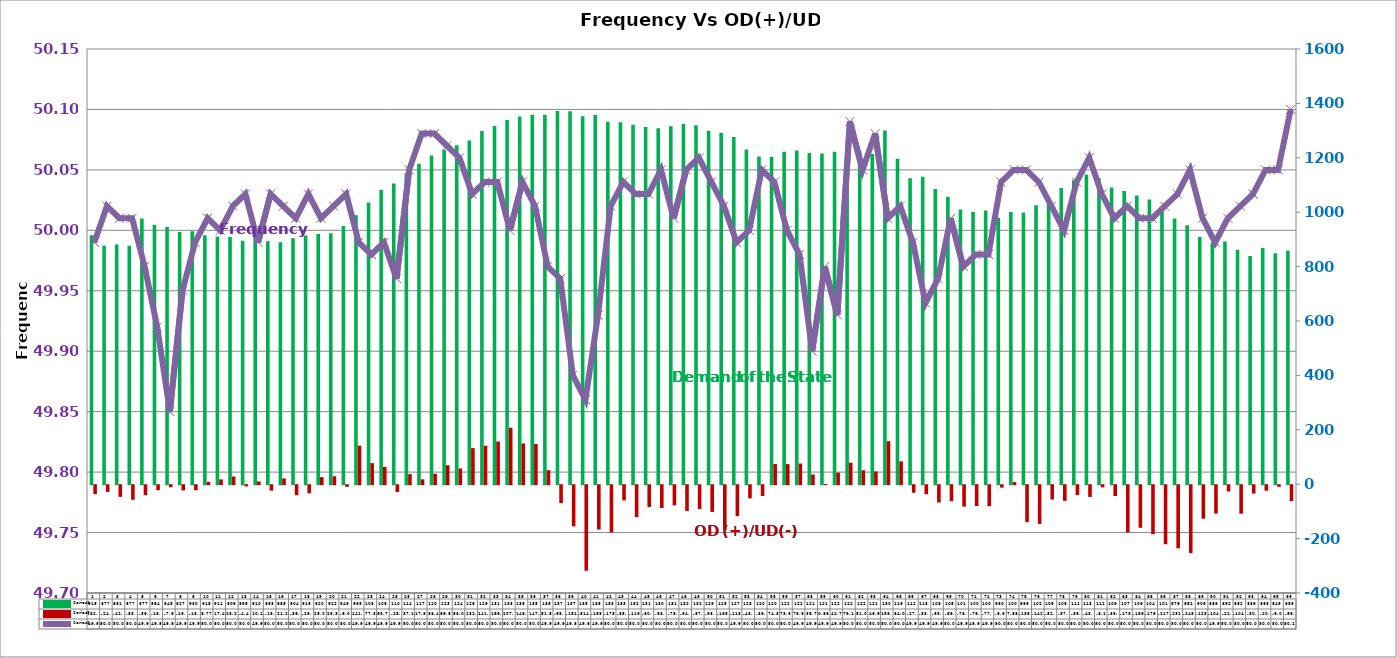
| Category | Series 2 | Series 4 |
|---|---|---|
| 0 | 914.9 | -32.94 |
| 1 | 877.04 | -24.55 |
| 2 | 881.47 | -42.81 |
| 3 | 877.09 | -53.72 |
| 4 | 976.62 | -36.62 |
| 5 | 954.1 | -18.34 |
| 6 | 945.46 | -7.66 |
| 7 | 927.01 | -19.03 |
| 8 | 929.94 | -18.55 |
| 9 | 915.07 | 8.77 |
| 10 | 910.5 | 17.48 |
| 11 | 909.36 | 28.27 |
| 12 | 894.89 | -4.48 |
| 13 | 910.31 | 10.11 |
| 14 | 893.38 | -19.97 |
| 15 | 889.34 | 21.27 |
| 16 | 904.35 | -36.99 |
| 17 | 914.54 | -29.83 |
| 18 | 920.1 | 26.02 |
| 19 | 922.18 | 29.35 |
| 20 | 949.48 | -6.07 |
| 21 | 988.92 | 141.82 |
| 22 | 1036.06 | 77.36 |
| 23 | 1082.62 | 63.73 |
| 24 | 1105.77 | -25.17 |
| 25 | 1140.54 | 37.14 |
| 26 | 1177.71 | 17.98 |
| 27 | 1208.2 | 38.46 |
| 28 | 1229.96 | 69.8 |
| 29 | 1245.75 | 58.04 |
| 30 | 1263.99 | 132.69 |
| 31 | 1298.32 | 141.41 |
| 32 | 1317.08 | 156.94 |
| 33 | 1339.31 | 207.72 |
| 34 | 1352.2 | 149.76 |
| 35 | 1357.86 | 147.77 |
| 36 | 1358.61 | 51.57 |
| 37 | 1371.63 | -65.87 |
| 38 | 1371.43 | -151.3 |
| 39 | 1353.04 | -314.39 |
| 40 | 1357.07 | -163.01 |
| 41 | 1332.44 | -173.99 |
| 42 | 1330.48 | -55.75 |
| 43 | 1321.18 | -116.83 |
| 44 | 1313.14 | -80.05 |
| 45 | 1308.82 | -83.81 |
| 46 | 1316.03 | -73.89 |
| 47 | 1324.12 | -94.72 |
| 48 | 1319.7 | -87.9 |
| 49 | 1299.36 | -98.27 |
| 50 | 1292.21 | -165.93 |
| 51 | 1276.49 | -113.54 |
| 52 | 1230.37 | -48.18 |
| 53 | 1204.33 | -39.61 |
| 54 | 1204.19 | 74.3 |
| 55 | 1222.5 | 73.86 |
| 56 | 1227.03 | 75.94 |
| 57 | 1217.94 | 35.73 |
| 58 | 1215.46 | 0.88 |
| 59 | 1222.09 | 42.77 |
| 60 | 1223.13 | 79.14 |
| 61 | 1222.9 | 51.08 |
| 62 | 1213.66 | 46.98 |
| 63 | 1300.43 | 158.29 |
| 64 | 1196.41 | 84.07 |
| 65 | 1124.53 | -27.65 |
| 66 | 1130.67 | -33.21 |
| 67 | 1085.64 | -63.55 |
| 68 | 1057.25 | -59.05 |
| 69 | 1010.19 | -78.66 |
| 70 | 1000.93 | -76.5 |
| 71 | 1006.34 | -77.36 |
| 72 | 979.78 | -8.98 |
| 73 | 1000.73 | 7.88 |
| 74 | 999.08 | -135.66 |
| 75 | 1025.18 | -142.31 |
| 76 | 1051.11 | -52.73 |
| 77 | 1088.92 | -57.57 |
| 78 | 1117.57 | -36.52 |
| 79 | 1138.76 | -43.01 |
| 80 | 1124.44 | -8.17 |
| 81 | 1091.17 | -39.86 |
| 82 | 1078.15 | -173.61 |
| 83 | 1061.18 | -156.61 |
| 84 | 1046.69 | -179.99 |
| 85 | 1016.54 | -217.14 |
| 86 | 976.46 | -232 |
| 87 | 951.67 | -249.55 |
| 88 | 908.7 | -123.13 |
| 89 | 888.94 | -104.26 |
| 90 | 892.46 | -22.99 |
| 91 | 861.75 | -104.79 |
| 92 | 839.08 | -30.79 |
| 93 | 868.36 | -20.29 |
| 94 | 849.25 | -6 |
| 95 | 858.74 | -59 |